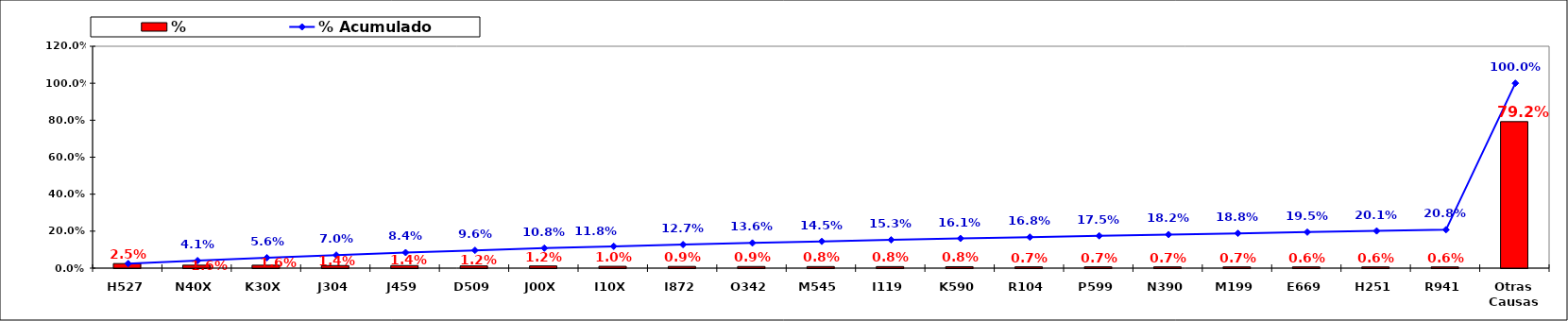
| Category | % |
|---|---|
| H527 | 0.025 |
| N40X | 0.016 |
| K30X | 0.016 |
| J304 | 0.014 |
| J459 | 0.014 |
| D509 | 0.012 |
| J00X | 0.012 |
| I10X | 0.01 |
| I872 | 0.009 |
| O342 | 0.009 |
| M545 | 0.008 |
| I119 | 0.008 |
| K590 | 0.008 |
| R104 | 0.007 |
| P599 | 0.007 |
| N390 | 0.007 |
| M199 | 0.007 |
| E669 | 0.006 |
| H251 | 0.006 |
| R941 | 0.006 |
| Otras Causas | 0.792 |